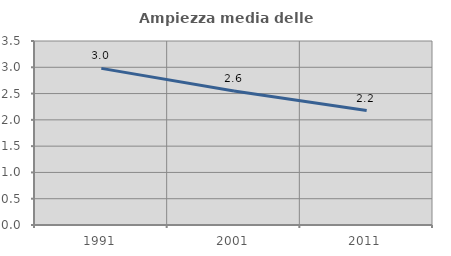
| Category | Ampiezza media delle famiglie |
|---|---|
| 1991.0 | 2.979 |
| 2001.0 | 2.55 |
| 2011.0 | 2.177 |